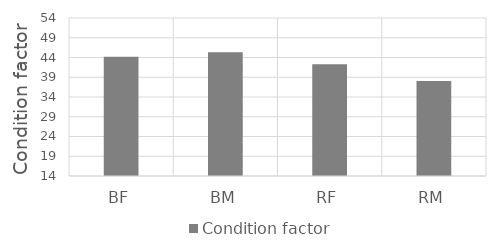
| Category | Condition factor |
|---|---|
| BF | 44.217 |
| BM | 45.333 |
| RF | 42.265 |
| RM | 38.076 |